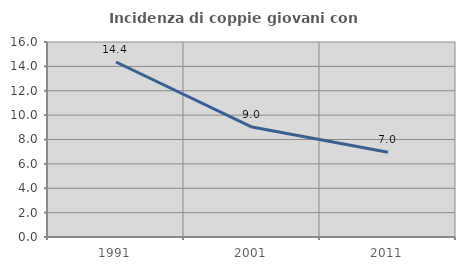
| Category | Incidenza di coppie giovani con figli |
|---|---|
| 1991.0 | 14.361 |
| 2001.0 | 9.02 |
| 2011.0 | 6.958 |